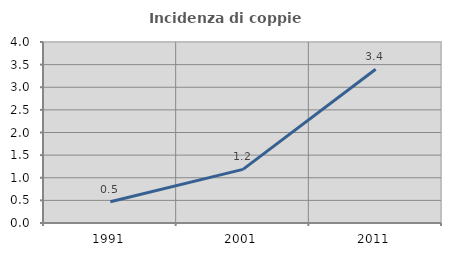
| Category | Incidenza di coppie miste |
|---|---|
| 1991.0 | 0.469 |
| 2001.0 | 1.186 |
| 2011.0 | 3.397 |